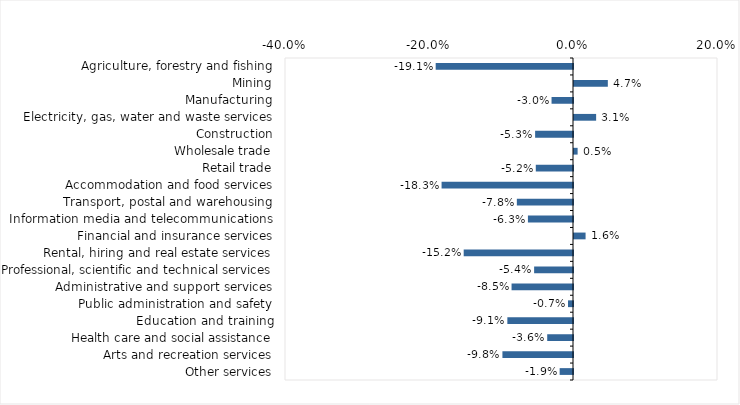
| Category | This week |
|---|---|
| Agriculture, forestry and fishing | -0.191 |
| Mining | 0.047 |
| Manufacturing | -0.03 |
| Electricity, gas, water and waste services | 0.031 |
| Construction | -0.053 |
| Wholesale trade | 0.005 |
| Retail trade | -0.052 |
| Accommodation and food services | -0.183 |
| Transport, postal and warehousing | -0.078 |
| Information media and telecommunications | -0.063 |
| Financial and insurance services | 0.016 |
| Rental, hiring and real estate services | -0.152 |
| Professional, scientific and technical services | -0.054 |
| Administrative and support services | -0.085 |
| Public administration and safety | -0.007 |
| Education and training | -0.091 |
| Health care and social assistance | -0.036 |
| Arts and recreation services | -0.098 |
| Other services | -0.019 |